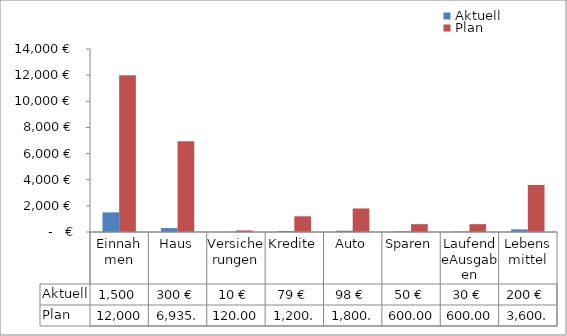
| Category | Aktuell | Plan |
|---|---|---|
| Einnahmen | 1500 | 12000 |
| Haus | 300 | 6935 |
| Versicherungen | 10 | 120 |
| Kredite | 79 | 1200 |
| Auto | 98 | 1800 |
| Sparen | 50 | 600 |
| LaufendeAusgaben | 30 | 600 |
| Lebensmittel | 200 | 3600 |